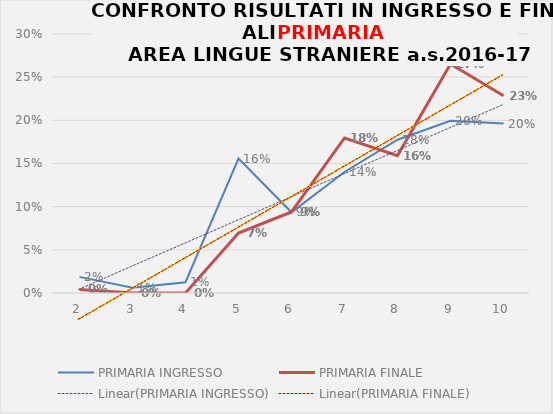
| Category | PRIMARIA INGRESSO | PRIMARIA FINALE |
|---|---|---|
| 2.0 | 0.019 | 0.004 |
| 3.0 | 0.006 | 0 |
| 4.0 | 0.012 | 0 |
| 5.0 | 0.156 | 0.069 |
| 6.0 | 0.093 | 0.094 |
| 7.0 | 0.14 | 0.18 |
| 8.0 | 0.178 | 0.159 |
| 9.0 | 0.199 | 0.265 |
| 10.0 | 0.196 | 0.229 |